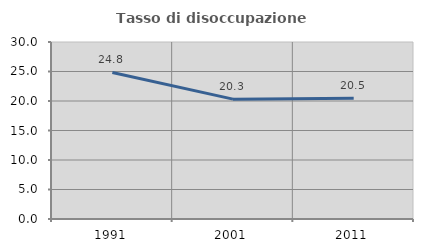
| Category | Tasso di disoccupazione giovanile  |
|---|---|
| 1991.0 | 24.837 |
| 2001.0 | 20.312 |
| 2011.0 | 20.455 |